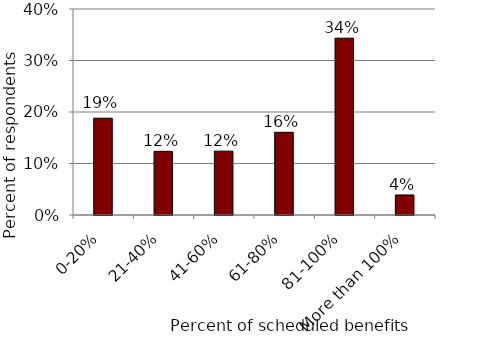
| Category | Control Group |
|---|---|
| 0-20% | 0.188 |
| 21-40% | 0.124 |
| 41-60% | 0.124 |
| 61-80% | 0.161 |
| 81-100% | 0.343 |
| More than 100% | 0.039 |